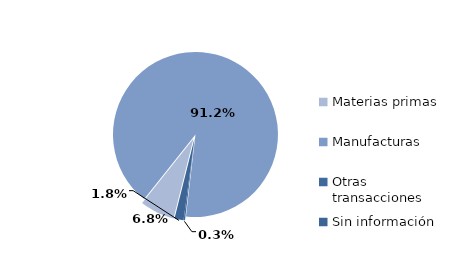
| Category | Series 0 |
|---|---|
| Materias primas | 486.143 |
| Manufacturas | 6521.602 |
| Otras transacciones | 19.601 |
| Sin información | 126.59 |